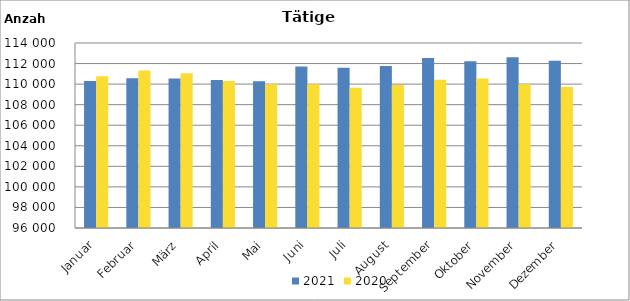
| Category | 2021 | 2020 |
|---|---|---|
| Januar | 110307 | 110769 |
| Februar | 110578 | 111324 |
| März | 110544 | 111047 |
| April | 110405 | 110307 |
| Mai | 110270 | 109989 |
| Juni | 111721 | 109996 |
| Juli | 111585 | 109645 |
| August | 111770 | 109917 |
| September | 112530 | 110419 |
| Oktober | 112218 | 110549 |
| November | 112617 | 109997 |
| Dezember | 112261 | 109728 |